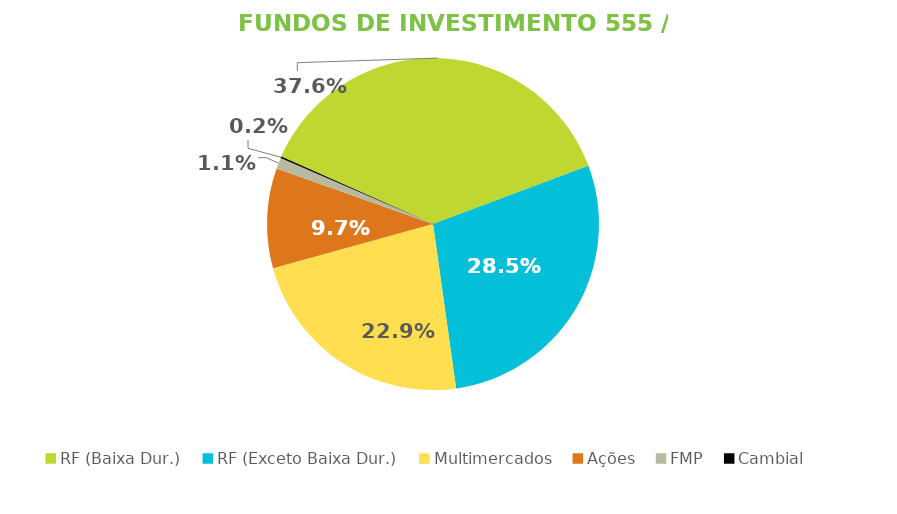
| Category | Fundos de Investimento 555 / FMP |
|---|---|
| RF (Baixa Dur.) | 0.376 |
| RF (Exceto Baixa Dur.) | 0.285 |
| Multimercados | 0.229 |
| Ações | 0.097 |
| FMP | 0.011 |
| Cambial | 0.002 |